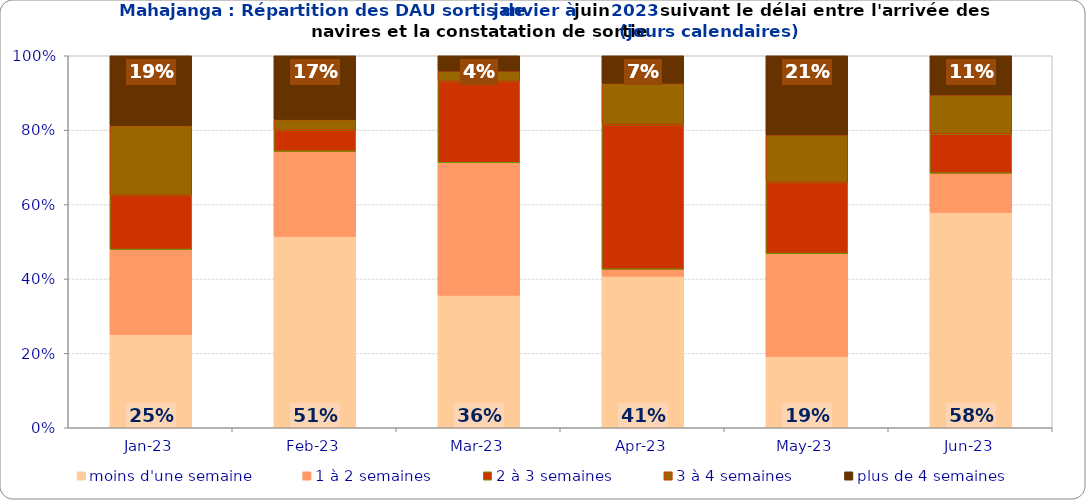
| Category | moins d'une semaine | 1 à 2 semaines | 2 à 3 semaines | 3 à 4 semaines | plus de 4 semaines |
|---|---|---|---|---|---|
| 2023-01-01 | 0.25 | 0.229 | 0.146 | 0.188 | 0.188 |
| 2023-02-01 | 0.514 | 0.229 | 0.057 | 0.029 | 0.171 |
| 2023-03-01 | 0.356 | 0.356 | 0.219 | 0.027 | 0.041 |
| 2023-04-01 | 0.407 | 0.019 | 0.389 | 0.111 | 0.074 |
| 2023-05-01 | 0.191 | 0.277 | 0.191 | 0.128 | 0.213 |
| 2023-06-01 | 0.579 | 0.105 | 0.105 | 0.105 | 0.105 |